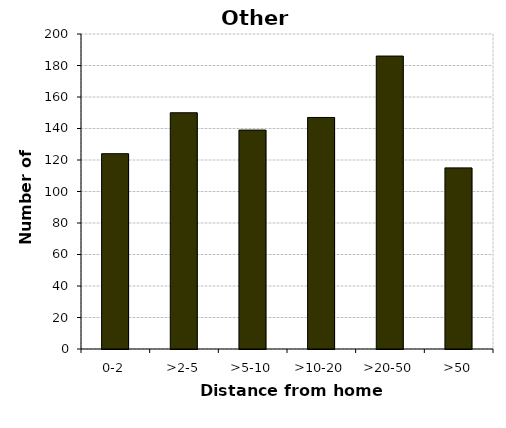
| Category | Other vehicles |
|---|---|
| 0-2 | 124 |
| >2-5 | 150 |
| >5-10 | 139 |
| >10-20 | 147 |
| >20-50 | 186 |
| >50 | 115 |